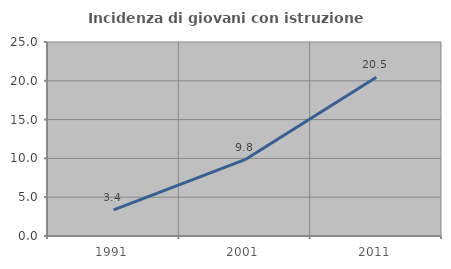
| Category | Incidenza di giovani con istruzione universitaria |
|---|---|
| 1991.0 | 3.371 |
| 2001.0 | 9.836 |
| 2011.0 | 20.455 |